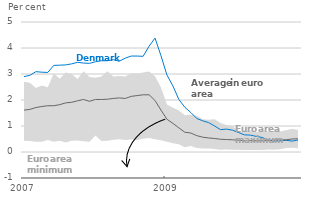
| Category | Euro area min
 | Euro area max
 | DK
 | Euro area average |
|---|---|---|---|---|
| 2007-01-01 | 0.43 | 2.7 | 2.9 | 1.61 |
| 2007-02-01 | 0.42 | 2.66 | 2.95 | 1.64 |
| 2007-03-01 | 0.39 | 2.46 | 3.09 | 1.71 |
| 2007-04-01 | 0.39 | 2.56 | 3.07 | 1.75 |
| 2007-05-01 | 0.46 | 2.49 | 3.06 | 1.78 |
| 2007-06-01 | 0.39 | 3.02 | 3.33 | 1.78 |
| 2007-07-01 | 0.43 | 2.82 | 3.34 | 1.82 |
| 2007-08-01 | 0.37 | 3.06 | 3.35 | 1.89 |
| 2007-09-01 | 0.43 | 3 | 3.39 | 1.91 |
| 2007-10-01 | 0.44 | 2.81 | 3.45 | 1.97 |
| 2007-11-01 | 0.41 | 3.11 | 3.42 | 2.02 |
| 2007-12-01 | 0.39 | 2.88 | 3.41 | 1.95 |
| 2008-01-01 | 0.63 | 2.86 | 3.47 | 2.02 |
| 2008-02-01 | 0.42 | 2.9 | 3.51 | 2.02 |
| 2008-03-01 | 0.43 | 3.11 | 3.51 | 2.03 |
| 2008-04-01 | 0.47 | 2.9 | 3.55 | 2.06 |
| 2008-05-01 | 0.49 | 2.92 | 3.49 | 2.08 |
| 2008-06-01 | 0.46 | 2.9 | 3.61 | 2.06 |
| 2008-07-01 | 0.48 | 3.03 | 3.69 | 2.14 |
| 2008-08-01 | 0.46 | 3.02 | 3.69 | 2.17 |
| 2008-09-01 | 0.51 | 3.06 | 3.68 | 2.2 |
| 2008-10-01 | 0.54 | 3.1 | 4.07 | 2.2 |
| 2008-11-01 | 0.49 | 2.91 | 4.38 | 1.98 |
| 2008-12-01 | 0.45 | 2.48 | 3.7 | 1.61 |
| 2009-01-01 | 0.39 | 1.83 | 2.96 | 1.26 |
| 2009-02-01 | 0.34 | 1.7 | 2.54 | 1.1 |
| 2009-03-01 | 0.3 | 1.6 | 2.02 | 0.93 |
| 2009-04-01 | 0.18 | 1.41 | 1.72 | 0.76 |
| 2009-05-01 | 0.23 | 1.43 | 1.52 | 0.73 |
| 2009-06-01 | 0.15 | 1.39 | 1.29 | 0.63 |
| 2009-07-01 | 0.13 | 1.26 | 1.2 | 0.57 |
| 2009-08-01 | 0.13 | 1.24 | 1.13 | 0.54 |
| 2009-09-01 | 0.12 | 1.26 | 1 | 0.52 |
| 2009-10-01 | 0.09 | 1.12 | 0.86 | 0.49 |
| 2009-11-01 | 0.1 | 1.04 | 0.88 | 0.48 |
| 2009-12-01 | 0.09 | 1 | 0.84 | 0.47 |
| 2010-01-01 | 0.09 | 0.82 | 0.75 | 0.45 |
| 2010-02-01 | 0.08 | 0.79 | 0.66 | 0.44 |
| 2010-03-01 | 0.08 | 0.83 | 0.65 | 0.44 |
| 2010-04-01 | 0.08 | 0.77 | 0.6 | 0.43 |
| 2010-05-01 | 0.08 | 0.78 | 0.56 | 0.43 |
| 2010-06-01 | 0.1 | 0.8 | 0.46 | 0.44 |
| 2010-07-01 | 0.09 | 0.79 | 0.42 | 0.46 |
| 2010-08-01 | 0.11 | 0.79 | 0.43 | 0.46 |
| 2010-09-01 | 0.15 | 0.84 | 0.45 | 0.47 |
| 2010-10-01 | 0.16 | 0.89 | 0.42 | 0.5 |
| 2010-11-01 | 0.14 | 0.85 | 0.46 | 0.51 |
| 2010-12-01 | 0.11 | 0.83 | 0.47 | 0.51 |
| 2011-01-01 | 0.18 | 1 | 0.46 | 0.55 |
| 2011-02-01 | 0.16 | 0.91 | 0.47 | 0.53 |
| 2011-03-01 | 0.18 | 0.94 | 0.48 | 0.55 |
| 2011-04-01 | 0.18 | 1.11 | 0.58 | 0.62 |
| 2011-05-01 | 0.21 | 1.06 | 0.62 | 0.64 |
| 2011-06-01 | 0.24 | 1.18 | 0.65 | 0.68 |
| 2011-07-01 | 0.19 | 1.09 | 0.7 | 0.67 |
| 2011-08-01 | 0.19 | 1.09 | 0.73 | 0.69 |
| 2011-09-01 | 0.23 | 1.1 | 0.7 | 0.7 |
| 2011-10-01 | 0.17 | 1.11 | 0.69 | 0.7 |
| 2011-11-01 | 0.16 | 1.16 | 0.52 | 0.67 |
| 2011-12-01 | 0.13 | 1.21 | 0.43 | 0.66 |
| 2012-01-01 | 0.11 | 1.12 | 0.38 | 0.62 |
| 2012-02-01 | 0.11 | 1.11 | 0.35 | 0.61 |
| 2012-03-01 | 0.12 | 1.08 | 0.36 | 0.59 |
| 2012-04-01 | 0.12 | 1.04 | 0.31 | 0.56 |
| 2012-05-01 | 0.12 | 1.03 | 0.31 | 0.55 |
| 2012-06-01 | 0.08 | 0.98 | 0.3 | 0.53 |
| 2012-07-01 | 0.09 | 0.97 | 0.26 | 0.49 |
| 2012-08-01 | 0.07 | 1.01 | 0.24 | 0.47 |
| 2012-09-01 | 0.07 | 1.09 | 0.24 | 0.47 |
| 2012-10-01 | 0.05 | 1.13 | 0.23 | 0.46 |
| 2012-11-01 | 0.05 | 1.11 | 0.23 | 0.44 |
| 2012-12-01 | 0.05 | 1.09 | 0.24 | 0.42 |
| 2013-01-01 | 0.05 | 1 | 0.22 | 0.4 |
| 2013-02-01 | 0.05 | 1 | 0.23 | 0.4 |
| 2013-03-01 | 0.05 | 1.03 | 0.24 | 0.4 |
| 2013-04-01 | 0.05 | 0.98 | 0.22 | 0.39 |
| 2013-05-01 | 0.05 | 0.97 | 0.23 | 0.39 |
| 2013-06-01 | 0.05 | 0.94 | 0.27 | 0.38 |
| 2013-07-01 | 0.05 | 0.95 | 0.27 | 0.37 |
| 2013-08-01 | 0.05 | 0.95 | 0.23 | 0.37 |
| 2013-09-01 | 0.05 | 0.83 | 0.24 | 0.35 |
| 2013-10-01 | 0.05 | 0.78 | 0.2 | 0.34 |
| 2013-11-01 | 0.05 | 0.77 | 0.22 | 0.34 |
| 2013-12-01 | 0.05 | 0.77 | 0.23 | 0.34 |
| 2014-01-01 | 0.04 | 0.74 | 0.23 | 0.33 |
| 2014-02-01 | 0.06 | 0.72 | 0.23 | 0.33 |
| 2014-03-01 | 0.05 | 0.76 | 0.22 | 0.35 |
| 2014-04-01 | 0.05 | 0.72 | 0.2 | 0.34 |
| 2014-05-01 | 0.05 | 0.68 | 0.2 | 0.34 |
| 2014-06-01 | 0.04 | 0.65 | 0.22 | 0.31 |
| 2014-07-01 | 0.04 | 0.57 | 0.21 | 0.28 |
| 2014-08-01 | 0.04 | 0.56 | 0.22 | 0.28 |
| 2014-09-01 | 0.04 | 0.53 | 0.19 | 0.26 |
| 2014-10-01 | 0.03 | 0.47 | 0.2 | 0.24 |
| 2014-11-01 | 0.03 | 0.43 | 0.19 | 0.24 |
| 2014-12-01 | 0.03 | 0.47 | 0.2 | 0.24 |
| 2015-01-01 | 0.02 | 0.41 | 0.17 | 0.23 |
| 2015-02-01 | 0.02 | 0.38 | 0.13 | 0.22 |
| 2015-03-01 | 0.02 | 0.37 | 0.03 | 0.22 |
| 2015-04-01 | 0.02 | 0.34 | -0.05 | 0.19 |
| 2015-05-01 | 0.02 | 0.31 | -0.03 | 0.19 |
| 2015-06-01 | 0.02 | 0.31 | -0.05 | 0.19 |
| 2015-07-01 | 0.02 | 0.29 | -0.06 | 0.18 |
| 2015-08-01 | 0.02 | 0.29 | -0.06 | 0.18 |
| 2015-09-01 | 0.01 | 0.28 | -0.04 | 0.17 |
| 2015-10-01 | 0.02 | 0.29 | -0.03 | 0.17 |
| 2015-11-01 | 0.01 | 0.29 | -0.05 | 0.16 |
| 2015-12-01 | 0.01 | 0.24 | -0.05 | 0.15 |
| 2016-01-01 | 0.02 | 0.26 | -0.06 | 0.13 |
| 2016-02-01 | 0.01 | 0.24 | -0.07 | 0.13 |
| 2016-03-01 | 0.01 | 0.29 | -0.05 | 0.14 |
| 2016-04-01 | 0.01 | 0.25 | -0.06 | 0.12 |
| 2016-05-01 | -0.01 | 0.25 | -0.06 | 0.11 |
| 2016-06-01 | 0.01 | 0.24 | -0.06 | 0.11 |
| 2016-07-01 | 0.01 | 0.23 | -0.09 | 0.1 |
| 2016-08-01 | 0.01 | 0.2 | -0.09 | 0.09 |
| 2016-09-01 | 0 | 0.22 | -0.09 | 0.09 |
| 2016-10-01 | 0 | 0.21 | -0.09 | 0.08 |
| 2016-11-01 | 0 | 0.21 | -0.11 | 0.07 |
| 2016-12-01 | -0.07 | 0.15 | -0.14 | 0.06 |
| 2017-01-01 | -0.08 | 0.16 | -0.18 | 0.06 |
| 2017-02-01 | -0.07 | 0.15 | -0.19 | 0.05 |
| 2017-03-01 | -0.07 | 0.18 | -0.18 | 0.05 |
| 2017-04-01 | -0.07 | 0.16 | -0.17 | 0.05 |
| 2017-05-01 | -0.07 | 0.15 | -0.18 | 0.05 |
| 2017-06-01 | -0.08 | 0.14 | -0.18 | 0.04 |
| 2017-07-01 | -0.08 | 0.14 | -0.2 | 0.04 |
| 2017-08-01 | -0.08 | 0.14 | -0.21 | 0.04 |
| 2017-09-01 | -0.09 | 0.13 | -0.21 | 0.04 |
| 2017-10-01 | -0.08 | 0.17 | -0.22 | 0.04 |
| 2017-11-01 | -0.07 | 0.17 | -0.23 | 0.04 |
| 2017-12-01 | -0.08 | 0.16 | -0.24 | 0.04 |
| 2018-01-01 | -0.08 | 0.16 | -0.26 | 0.04 |
| 2018-02-01 | -0.06 | 0.15 | -0.27 | 0.04 |
| 2018-03-01 | -0.07 | 0.14 | -0.26 | 0.04 |
| 2018-04-01 | -0.06 | 0.17 | -0.26 | 0.04 |
| 2018-05-01 | -0.05 | 0.16 | -0.27 | 0.03 |
| 2018-06-01 | -0.05 | 0.14 | -0.29 | 0.04 |
| 2018-07-01 | -0.05 | 0.14 | -0.29 | 0.03 |
| 2018-08-01 | -0.04 | 0.14 | -0.3 | 0.03 |
| 2018-09-01 | -0.06 | 0.15 | -0.29 | 0.03 |
| 2018-10-01 | -0.06 | 0.16 | -0.3 | 0.03 |
| 2018-11-01 | -0.06 | 0.16 | -0.3 | 0.03 |
| 2018-12-01 | -0.08 | 0.14 | -0.29 | 0.03 |
| 2019-01-01 | -0.08 | 0.14 | -0.3 | 0.03 |